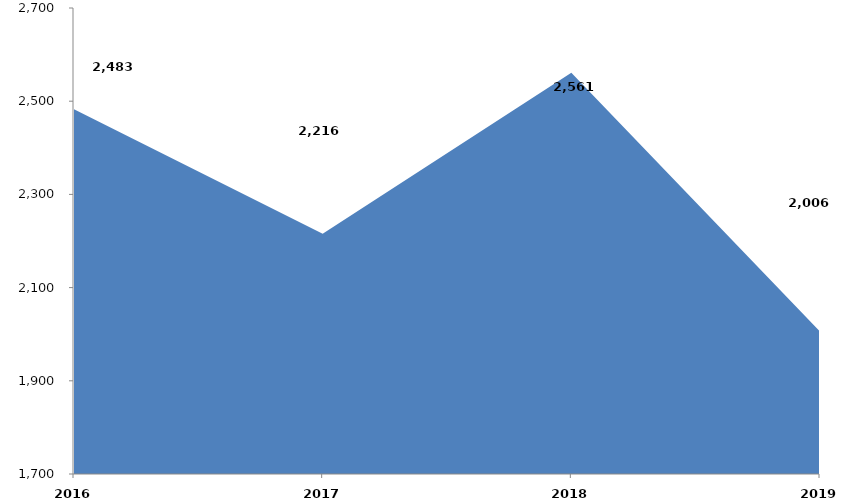
| Category | Series 0 |
|---|---|
| 2016 | 2482839.641 |
| 2017 | 2215623.385 |
| 2018 | 2561094.322 |
| 2019 | 2005795.846 |